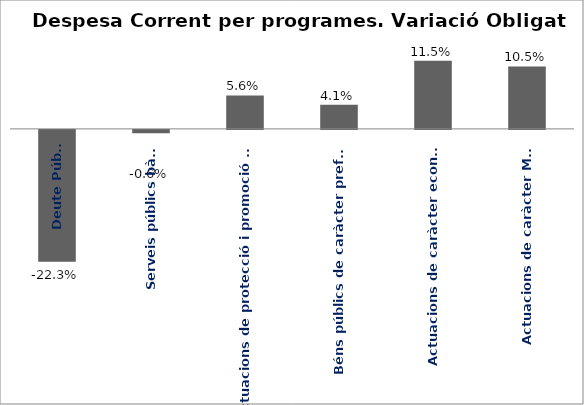
| Category | Series 0 |
|---|---|
| Deute Públic | -0.223 |
| Serveis públics bàsics | -0.006 |
| Actuacions de protecció i promoció social | 0.056 |
| Béns públics de caràcter preferent | 0.041 |
| Actuacions de caràcter econòmic | 0.115 |
| Actuacions de caràcter Marçal | 0.105 |